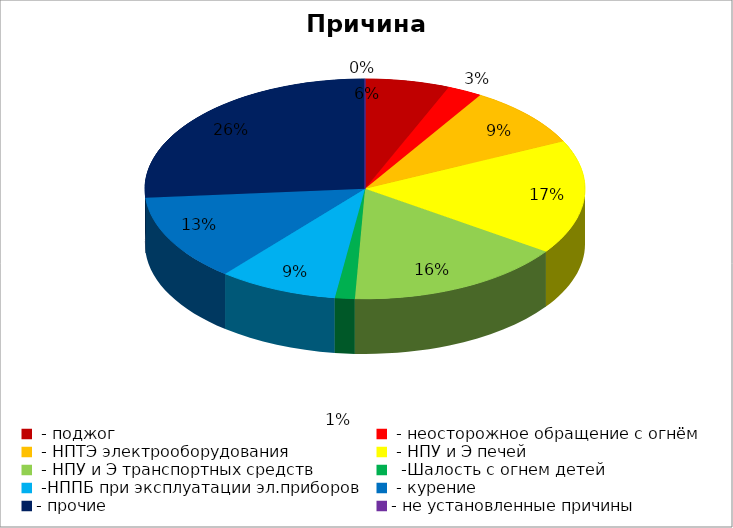
| Category | Причина пожара |
|---|---|
|  - поджог | 17 |
|  - неосторожное обращение с огнём | 7 |
|  - НПТЭ электрооборудования | 25 |
|  - НПУ и Э печей | 46 |
|  - НПУ и Э транспортных средств | 44 |
|   -Шалость с огнем детей | 4 |
|  -НППБ при эксплуатации эл.приборов | 24 |
|  - курение | 35 |
| - прочие | 72 |
| - не установленные причины | 0 |